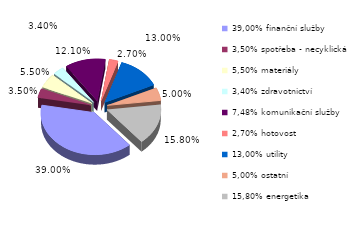
| Category | Series 0 |
|---|---|
| 39,00% finanční služby | 0.39 |
| 3,50% spotřeba - necyklická | 0.035 |
| 5,50% materiály | 0.055 |
| 3,40% zdravotnictví | 0.034 |
| 7,48% komunikační služby | 0.121 |
| 2,70% hotovost | 0.027 |
| 13,00% utility | 0.13 |
| 5,00% ostatní | 0.05 |
| 15,80% energetika | 0.158 |